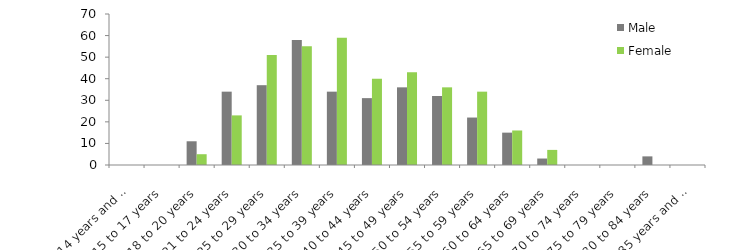
| Category | Male | Female |
|---|---|---|
| 14 years and under | 0 | 0 |
| 15 to 17 years | 0 | 0 |
| 18 to 20 years | 11 | 5 |
| 21 to 24 years | 34 | 23 |
| 25 to 29 years | 37 | 51 |
| 30 to 34 years | 58 | 55 |
| 35 to 39 years | 34 | 59 |
| 40 to 44 years | 31 | 40 |
| 45 to 49 years | 36 | 43 |
| 50 to 54 years | 32 | 36 |
| 55 to 59 years | 22 | 34 |
| 60 to 64 years | 15 | 16 |
| 65 to 69 years | 3 | 7 |
| 70 to 74 years | 0 | 0 |
| 75 to 79 years | 0 | 0 |
| 80 to 84 years | 4 | 0 |
| 85 years and over | 0 | 0 |